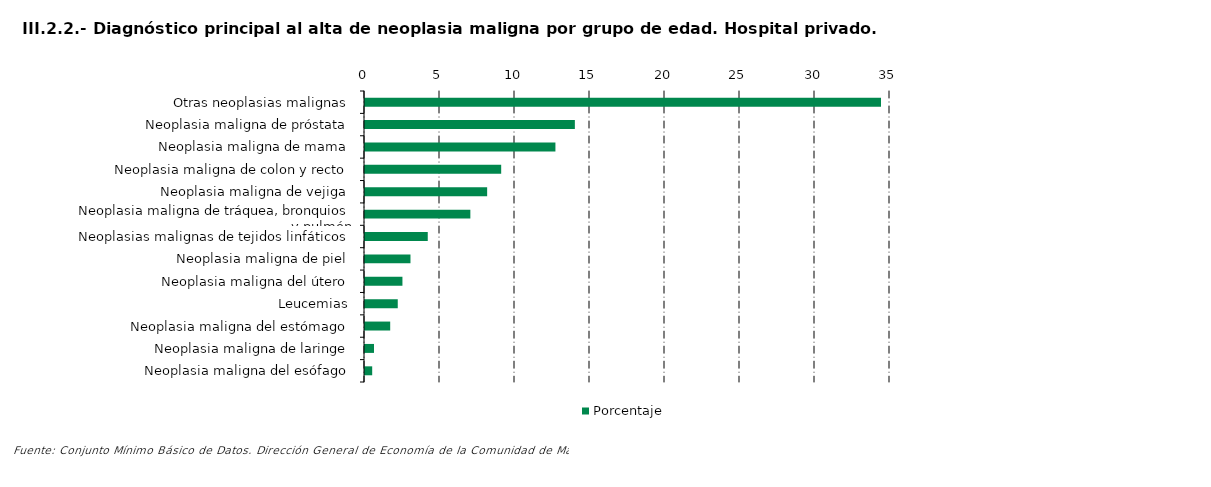
| Category | Porcentaje |
|---|---|
| Otras neoplasias malignas | 34.4 |
| Neoplasia maligna de próstata | 13.991 |
| Neoplasia maligna de mama | 12.695 |
| Neoplasia maligna de colon y recto | 9.079 |
| Neoplasia maligna de vejiga | 8.143 |
| Neoplasia maligna de tráquea, bronquios y pulmón | 7.023 |
| Neoplasias malignas de tejidos linfáticos | 4.184 |
| Neoplasia maligna de piel | 3.032 |
| Neoplasia maligna del útero | 2.496 |
| Leucemias | 2.184 |
| Neoplasia maligna del estómago | 1.68 |
| Neoplasia maligna de laringe | 0.6 |
| Neoplasia maligna del esófago | 0.48 |